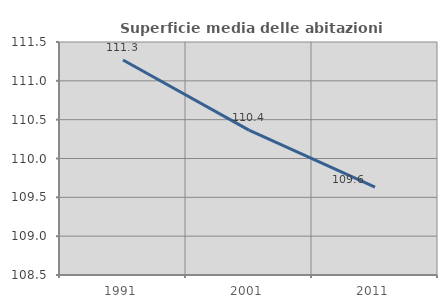
| Category | Superficie media delle abitazioni occupate |
|---|---|
| 1991.0 | 111.268 |
| 2001.0 | 110.365 |
| 2011.0 | 109.631 |